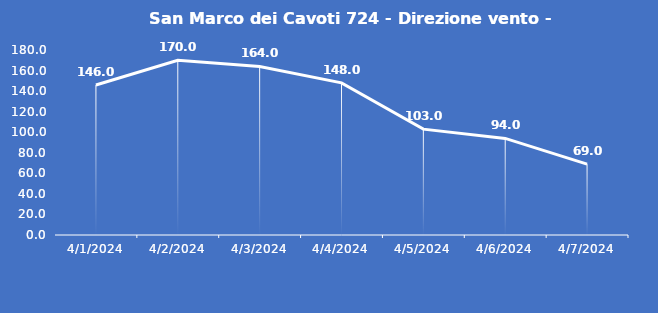
| Category | San Marco dei Cavoti 724 - Direzione vento - Grezzo (°N) |
|---|---|
| 4/1/24 | 146 |
| 4/2/24 | 170 |
| 4/3/24 | 164 |
| 4/4/24 | 148 |
| 4/5/24 | 103 |
| 4/6/24 | 94 |
| 4/7/24 | 69 |